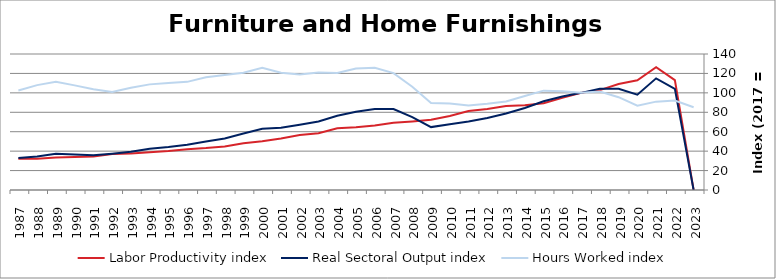
| Category | Labor Productivity index | Real Sectoral Output index | Hours Worked index |
|---|---|---|---|
| 2023.0 | 0 | 0 | 85.188 |
| 2022.0 | 113.113 | 104.087 | 92.021 |
| 2021.0 | 126.364 | 114.931 | 90.952 |
| 2020.0 | 112.919 | 98.073 | 86.853 |
| 2019.0 | 109.07 | 104.187 | 95.523 |
| 2018.0 | 102.859 | 104.223 | 101.326 |
| 2017.0 | 100 | 100 | 100 |
| 2016.0 | 94.824 | 96.307 | 101.564 |
| 2015.0 | 89.284 | 91.314 | 102.274 |
| 2014.0 | 87.298 | 84.403 | 96.684 |
| 2013.0 | 86.484 | 78.789 | 91.103 |
| 2012.0 | 83.498 | 74.037 | 88.67 |
| 2011.0 | 81.229 | 70.559 | 86.864 |
| 2010.0 | 76.088 | 67.792 | 89.096 |
| 2009.0 | 72.212 | 64.752 | 89.669 |
| 2008.0 | 70.559 | 74.991 | 106.281 |
| 2007.0 | 69.335 | 83.414 | 120.305 |
| 2006.0 | 66.348 | 83.493 | 125.842 |
| 2005.0 | 64.482 | 80.655 | 125.081 |
| 2004.0 | 63.445 | 76.433 | 120.471 |
| 2003.0 | 58.365 | 70.576 | 120.923 |
| 2002.0 | 56.52 | 67.205 | 118.905 |
| 2001.0 | 53.122 | 64.085 | 120.637 |
| 2000.0 | 50.167 | 63.147 | 125.875 |
| 1999.0 | 48.205 | 58.218 | 120.771 |
| 1998.0 | 44.872 | 53.077 | 118.284 |
| 1997.0 | 43.111 | 50.028 | 116.043 |
| 1996.0 | 41.928 | 46.675 | 111.322 |
| 1995.0 | 40.173 | 44.235 | 110.112 |
| 1994.0 | 38.973 | 42.378 | 108.737 |
| 1993.0 | 37.507 | 39.44 | 105.154 |
| 1992.0 | 37.113 | 37.405 | 100.787 |
| 1991.0 | 34.514 | 35.762 | 103.616 |
| 1990.0 | 33.921 | 36.536 | 107.709 |
| 1989.0 | 33.448 | 37.252 | 111.375 |
| 1988.0 | 32.05 | 34.604 | 107.968 |
| 1987.0 | 32.261 | 33.029 | 102.383 |